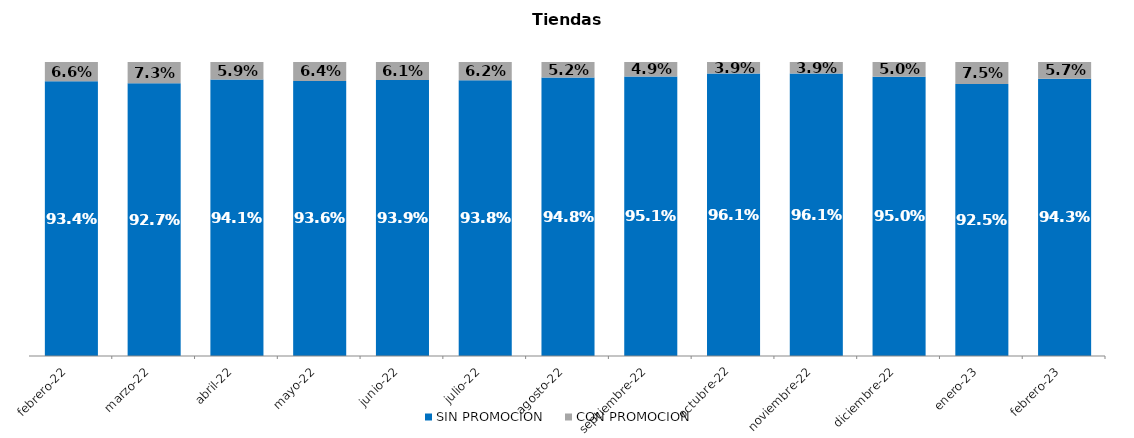
| Category | SIN PROMOCION   | CON PROMOCION   |
|---|---|---|
| 2022-02-01 | 0.934 | 0.066 |
| 2022-03-01 | 0.927 | 0.073 |
| 2022-04-01 | 0.941 | 0.059 |
| 2022-05-01 | 0.936 | 0.064 |
| 2022-06-01 | 0.939 | 0.061 |
| 2022-07-01 | 0.938 | 0.062 |
| 2022-08-01 | 0.948 | 0.052 |
| 2022-09-01 | 0.951 | 0.049 |
| 2022-10-01 | 0.961 | 0.039 |
| 2022-11-01 | 0.961 | 0.039 |
| 2022-12-01 | 0.95 | 0.05 |
| 2023-01-01 | 0.925 | 0.075 |
| 2023-02-01 | 0.943 | 0.057 |